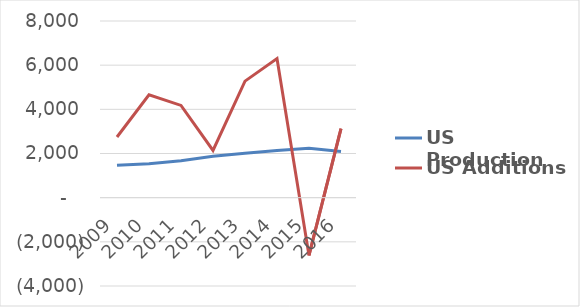
| Category | US Production | US Additions |
|---|---|---|
| 2009 | 1462.353 | 2747.755 |
| 2010 | 1535.59 | 4657.859 |
| 2011 | 1674.38 | 4177.821 |
| 2012 | 1870.644 | 2136.53 |
| 2013 | 2012.144 | 5277.426 |
| 2014 | 2134.804 | 6298.257 |
| 2015 | 2232.252 | -2616.845 |
| 2016 | 2091.951 | 3121.955 |